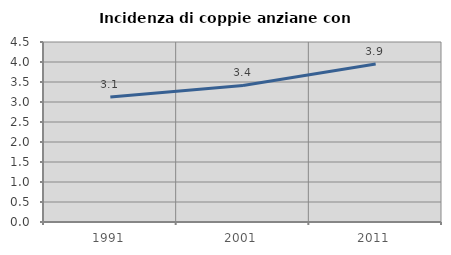
| Category | Incidenza di coppie anziane con figli |
|---|---|
| 1991.0 | 3.128 |
| 2001.0 | 3.415 |
| 2011.0 | 3.947 |